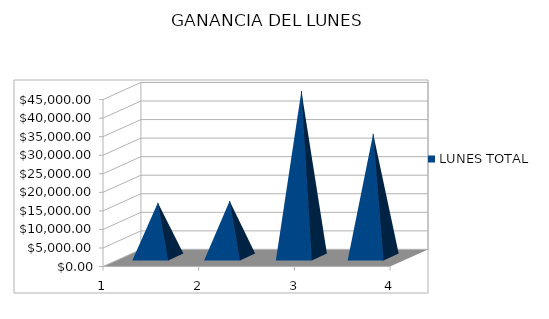
| Category | LUNES TOTAL |
|---|---|
| 0 | 14637 |
| 1 | 15088 |
| 2 | 44772 |
| 3 | 33210 |